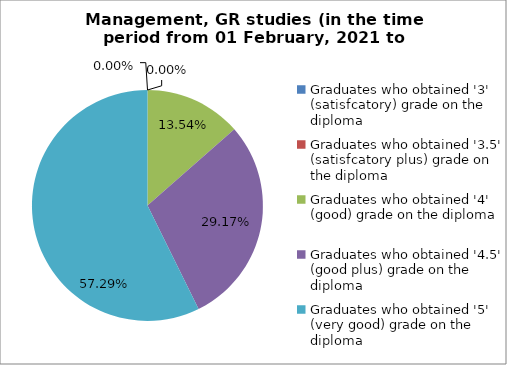
| Category | Series 0 |
|---|---|
| Graduates who obtained '3' (satisfcatory) grade on the diploma  | 0 |
| Graduates who obtained '3.5' (satisfcatory plus) grade on the diploma  | 0 |
| Graduates who obtained '4' (good) grade on the diploma  | 13.542 |
| Graduates who obtained '4.5' (good plus) grade on the diploma  | 29.167 |
| Graduates who obtained '5' (very good) grade on the diploma  | 57.292 |